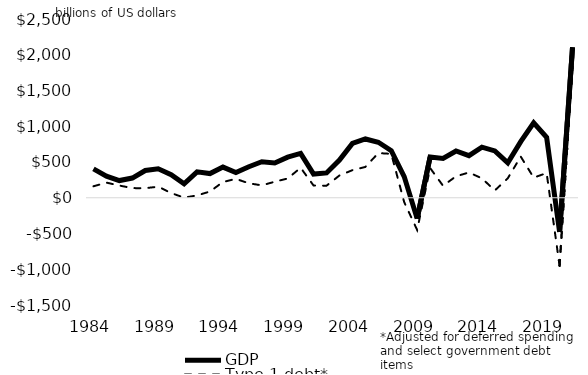
| Category | GDP | Type 1 debt* |
|---|---|---|
| 1984.0 | 403.6 | 160.421 |
| 1985.0 | 301.4 | 211.676 |
| 1986.0 | 240.6 | 170.526 |
| 1987.0 | 275.6 | 134.762 |
| 1988.0 | 381.2 | 133.879 |
| 1989.0 | 405.2 | 154.688 |
| 1990.0 | 321.5 | 65.76 |
| 1991.0 | 195 | 1.031 |
| 1992.0 | 362.2 | 32.797 |
| 1993.0 | 338.3 | 87.342 |
| 1994.0 | 428.6 | 220.483 |
| 1995.0 | 352.5 | 263.988 |
| 1996.0 | 433.4 | 201.837 |
| 1997.0 | 504.5 | 173.374 |
| 1998.0 | 485.2 | 224.109 |
| 1999.0 | 568.4 | 269.605 |
| 2000.0 | 619.8 | 419.453 |
| 2001.0 | 330.9 | 170.764 |
| 2002.0 | 347.2 | 168.302 |
| 2003.0 | 527.4 | 311.899 |
| 2004.0 | 760.7 | 385.907 |
| 2005.0 | 822 | 431.247 |
| 2006.0 | 776.4 | 624.585 |
| 2007.0 | 658.6 | 613.978 |
| 2008.0 | 295.7 | -61.941 |
| 2009.0 | -291.8 | -450.634 |
| 2010.0 | 570.9 | 415.435 |
| 2011.0 | 550.7 | 167.072 |
| 2012.0 | 654.3 | 300.022 |
| 2013.0 | 589.2 | 353.277 |
| 2014.0 | 707.5 | 271.706 |
| 2015.0 | 655.3 | 102.057 |
| 2016.0 | 489.1 | 271.861 |
| 2017.0 | 784.5 | 575.666 |
| 2018.0 | 1047.6 | 281.453 |
| 2019.0 | 845.4 | 345.591 |
| 2020.0 | -478.9 | -952.189 |
| 2021.0 | 2104.3 | 1833.034 |